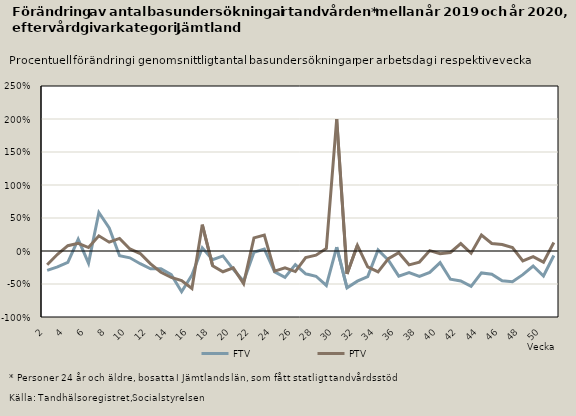
| Category | FTV | PTV |
|---|---|---|
| 2.0 | -0.293 | -0.208 |
| 3.0 | -0.242 | -0.049 |
| 4.0 | -0.172 | 0.08 |
| 5.0 | 0.177 | 0.116 |
| 6.0 | -0.184 | 0.052 |
| 7.0 | 0.584 | 0.23 |
| 8.0 | 0.35 | 0.133 |
| 9.0 | -0.071 | 0.191 |
| 10.0 | -0.103 | 0.031 |
| 11.0 | -0.193 | -0.039 |
| 12.0 | -0.269 | -0.196 |
| 13.0 | -0.271 | -0.322 |
| 14.0 | -0.359 | -0.401 |
| 15.0 | -0.617 | -0.449 |
| 16.0 | -0.365 | -0.567 |
| 17.0 | 0.048 | 0.399 |
| 18.0 | -0.132 | -0.223 |
| 19.0 | -0.075 | -0.314 |
| 20.0 | -0.278 | -0.255 |
| 21.0 | -0.458 | -0.494 |
| 22.0 | -0.018 | 0.199 |
| 23.0 | 0.031 | 0.24 |
| 24.0 | -0.316 | -0.305 |
| 25.0 | -0.399 | -0.255 |
| 26.0 | -0.205 | -0.311 |
| 27.0 | -0.345 | -0.101 |
| 28.0 | -0.383 | -0.064 |
| 29.0 | -0.522 | 0.039 |
| 30.0 | 0.057 | 2 |
| 31.0 | -0.558 | -0.348 |
| 32.0 | -0.456 | 0.086 |
| 33.0 | -0.387 | -0.24 |
| 34.0 | 0.018 | -0.317 |
| 35.0 | -0.139 | -0.116 |
| 36.0 | -0.381 | -0.025 |
| 37.0 | -0.326 | -0.21 |
| 38.0 | -0.386 | -0.168 |
| 39.0 | -0.325 | 0.006 |
| 40.0 | -0.177 | -0.04 |
| 41.0 | -0.427 | -0.022 |
| 42.0 | -0.455 | 0.112 |
| 43.0 | -0.536 | -0.034 |
| 44.0 | -0.332 | 0.241 |
| 45.0 | -0.352 | 0.115 |
| 46.0 | -0.452 | 0.098 |
| 47.0 | -0.465 | 0.053 |
| 48.0 | -0.358 | -0.15 |
| 49.0 | -0.227 | -0.085 |
| 50.0 | -0.379 | -0.169 |
| 51.0 | -0.069 | 0.129 |